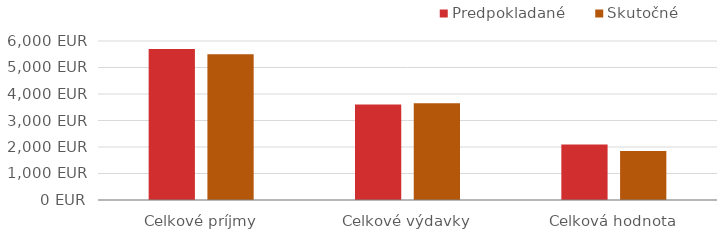
| Category | Predpokladané | Skutočné |
|---|---|---|
| Celkové príjmy | 5700 | 5500 |
| Celkové výdavky | 3603 | 3655 |
| Celková hodnota | 2097 | 1845 |